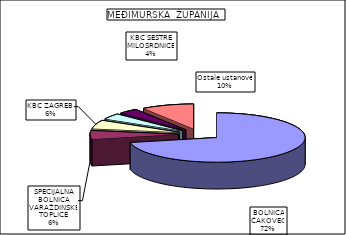
| Category | Series 0 |
|---|---|
| BOLNICA ČAKOVEC | 71.745 |
| SPECIJALNA BOLNICA VARAŽDINSKE TOPLICE | 5.656 |
| KBC ZAGREB  | 5.616 |
| OB VARAŽDIN | 3.826 |
| KBC SESTRE MILOSRDNICE | 3.586 |
| Ostale ustanove | 9.572 |